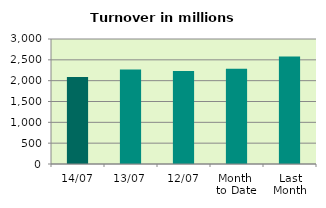
| Category | Series 0 |
|---|---|
| 14/07 | 2086.449 |
| 13/07 | 2266.649 |
| 12/07 | 2234.098 |
| Month 
to Date | 2288.416 |
| Last
Month | 2579.746 |